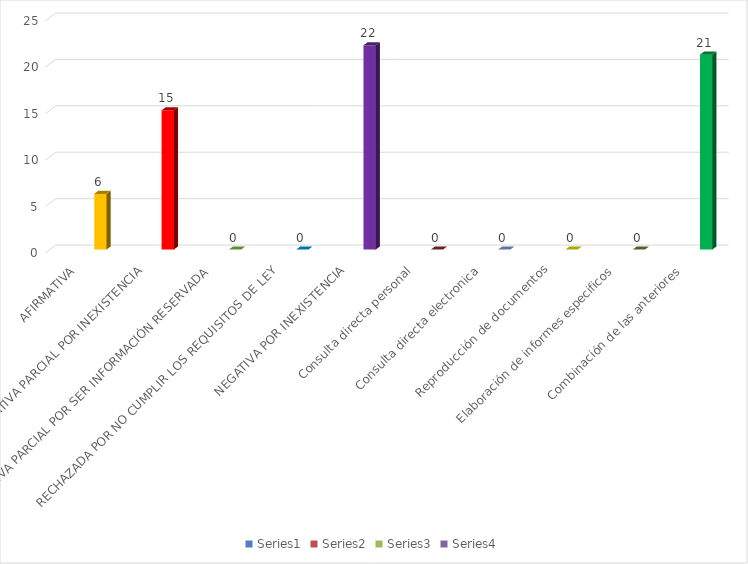
| Category | Series 0 | Series 1 | Series 2 | Series 3 |
|---|---|---|---|---|
| AFIRMATIVA |  |  |  | 6 |
| AFIRMATIVA PARCIAL POR INEXISTENCIA |  |  |  | 15 |
| AFIRMATIVA PARCIAL POR SER INFORMACIÓN RESERVADA |  |  |  | 0 |
| RECHAZADA POR NO CUMPLIR LOS REQUISITOS DE LEY |  |  |  | 0 |
| NEGATIVA POR INEXISTENCIA |  |  |  | 22 |
| Consulta directa personal |  |  |  | 0 |
| Consulta directa electronica |  |  |  | 0 |
| Reproducción de documentos |  |  |  | 0 |
| Elaboración de informes especificos |  |  |  | 0 |
| Combinación de las anteriores |  |  |  | 21 |